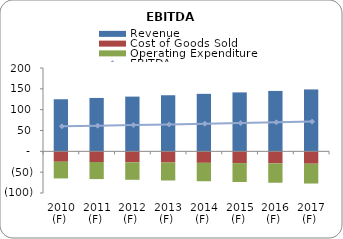
| Category | Revenue | Cost of Goods Sold | Operating Expenditure |
|---|---|---|---|
| 2010 (F)  | 125 | -25 | -40 |
| 2011 (F)  | 128.125 | -25.625 | -41 |
| 2012 (F)  | 131.328 | -26.266 | -42.025 |
| 2013 (F)  | 134.611 | -26.922 | -43.076 |
| 2014 (F)  | 137.977 | -27.595 | -44.153 |
| 2015 (F)  | 141.426 | -28.285 | -45.256 |
| 2016 (F)  | 144.962 | -28.992 | -46.388 |
| 2017 (F)  | 148.586 | -29.717 | -47.547 |